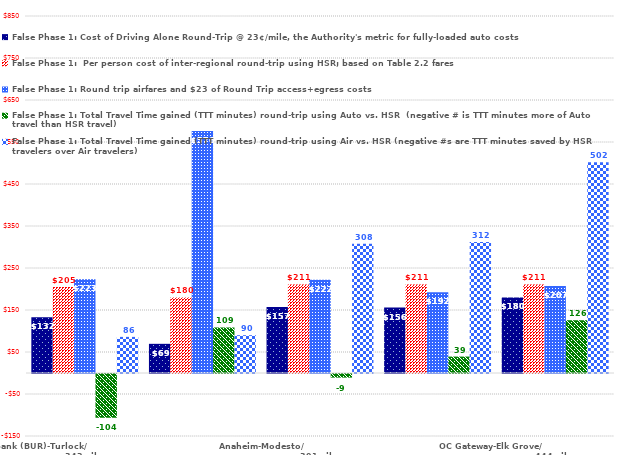
| Category | False Phase 1: Cost of Driving Alone Round-Trip @ 23¢/mile, the Authority's metric for fully-loaded auto costs | False Phase 1:  Per person cost of inter-regional round-trip using HSR; based on Table 2.2 fares | False Phase 1: Round trip airfares and $23 of Round Trip access+egress costs | False Phase 1: Total Travel Time gained (TTT minutes) round-trip using Auto vs. HSR  (negative # is TTT minutes more of Auto travel than HSR travel) | False Phase 1: Total Travel Time gained (TTT minutes) round-trip using Air vs. HSR (negative #s are TTT minutes saved by HSR travelers over Air travelers) |
|---|---|---|---|---|---|
| Burbank (BUR)-Turlock/                                       342miles | 132.48 | 205 | 223 | -104.1 | 86 |
| Oakland-Madera/                                          179miles | 69.46 | 179.9 | 576 | 108.5 | 90 |
| Anaheim-Modesto/                                           391miles | 156.86 | 211 | 222 | -8.6 | 308 |
| Los Angeles-Stockton/                                              392miles | 155.94 | 211 | 192 | 39.1 | 312 |
| OC Gateway-Elk Grove/                                               444miles | 179.86 | 211 | 207 | 125.6 | 502 |